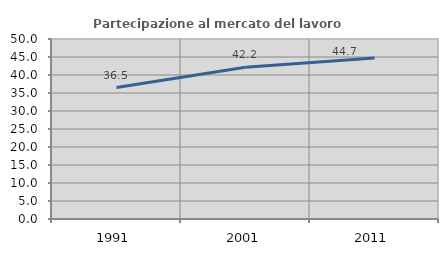
| Category | Partecipazione al mercato del lavoro  femminile |
|---|---|
| 1991.0 | 36.501 |
| 2001.0 | 42.158 |
| 2011.0 | 44.716 |